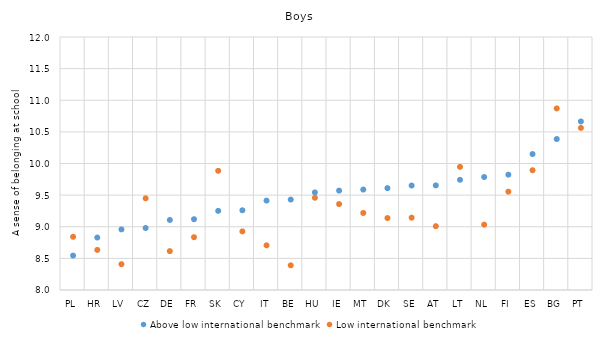
| Category | Above low international benchmark | Low international benchmark |
|---|---|---|
| PL | 8.544 | 8.841 |
| HR | 8.829 | 8.634 |
| LV | 8.958 | 8.408 |
| CZ | 8.98 | 9.449 |
| DE | 9.107 | 8.615 |
| FR | 9.119 | 8.834 |
| SK | 9.251 | 9.884 |
| CY | 9.26 | 8.927 |
| IT | 9.414 | 8.706 |
| BE | 9.43 | 8.39 |
| HU | 9.543 | 9.458 |
| IE | 9.571 | 9.359 |
| MT | 9.588 | 9.218 |
| DK | 9.61 | 9.138 |
| SE | 9.652 | 9.143 |
| AT | 9.654 | 9.009 |
| LT | 9.742 | 9.947 |
| NL | 9.786 | 9.033 |
| FI | 9.824 | 9.555 |
| ES | 10.149 | 9.893 |
| BG | 10.387 | 10.871 |
| PT | 10.665 | 10.563 |